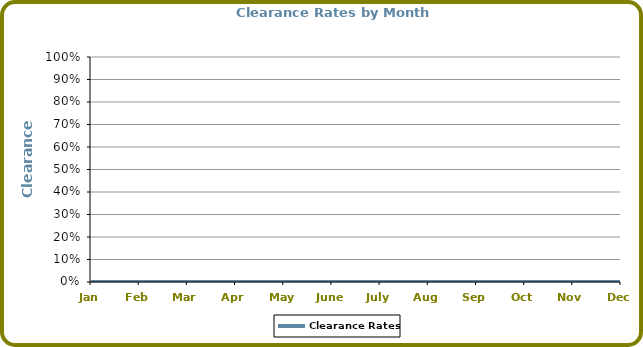
| Category | Clearance Rates |
|---|---|
| Jan | 0 |
| Feb | 0 |
| Mar | 0 |
| Apr | 0 |
| May | 0 |
| June | 0 |
| July | 0 |
| Aug | 0 |
| Sep | 0 |
| Oct | 0 |
| Nov | 0 |
| Dec | 0 |